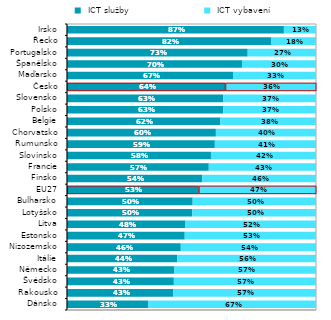
| Category |  ICT služby |  ICT vybavení |
|---|---|---|
| Dánsko | 0.327 | 0.673 |
| Rakousko | 0.427 | 0.573 |
| Švédsko | 0.429 | 0.571 |
| Německo | 0.431 | 0.569 |
| Itálie | 0.443 | 0.557 |
| Nizozemsko | 0.457 | 0.543 |
| Estonsko | 0.473 | 0.527 |
| Litva | 0.476 | 0.524 |
| Lotyšsko | 0.503 | 0.497 |
| Bulharsko | 0.505 | 0.495 |
| EU27 | 0.528 | 0.472 |
| Finsko | 0.543 | 0.457 |
| Francie | 0.569 | 0.431 |
| Slovinsko | 0.578 | 0.422 |
| Rumunsko | 0.594 | 0.406 |
| Chorvatsko | 0.598 | 0.402 |
| Belgie | 0.616 | 0.384 |
| Polsko | 0.627 | 0.373 |
| Slovensko | 0.628 | 0.372 |
| Česko | 0.636 | 0.364 |
| Maďarsko | 0.667 | 0.333 |
| Španělsko | 0.703 | 0.297 |
| Portugalsko | 0.726 | 0.274 |
| Řecko | 0.821 | 0.179 |
| Irsko | 0.871 | 0.129 |